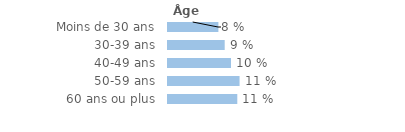
| Category | Series 0 |
|---|---|
| Moins de 30 ans | 0.08 |
| 30-39 ans | 0.09 |
| 40-49 ans | 0.1 |
| 50-59 ans | 0.114 |
| 60 ans ou plus | 0.11 |